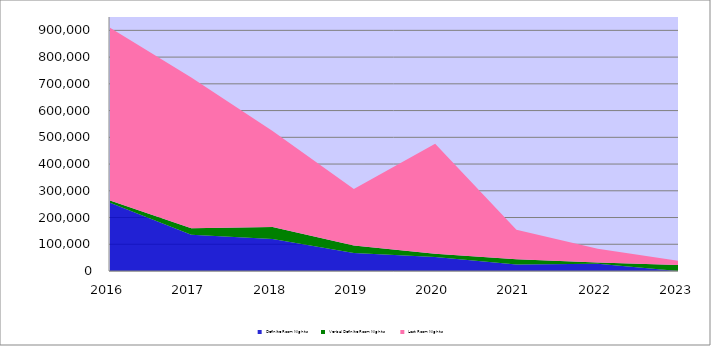
| Category | Definite Room Nights | Verbal Definite Room Nights | Lost Room Nights |
|---|---|---|---|
| 2016.0 | 255592 | 7649 | 646249 |
| 2017.0 | 135162 | 25177 | 563322 |
| 2018.0 | 119738 | 44777 | 358919 |
| 2019.0 | 67679 | 28119 | 210951 |
| 2020.0 | 52056 | 12090 | 412042 |
| 2021.0 | 23925 | 20387 | 109665 |
| 2022.0 | 27014 | 5000 | 50917 |
| 2023.0 | 0 | 22743 | 15180 |